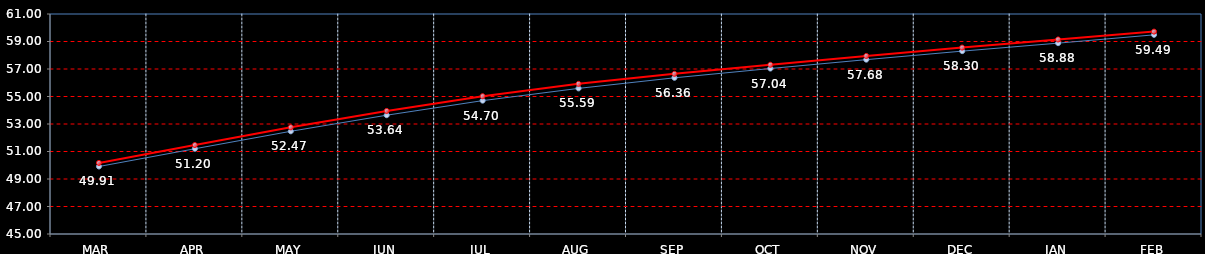
| Category | Last | Settlement |
|---|---|---|
| MAR | 49.91 | 50.17 |
| APR | 51.2 | 51.47 |
| MAY | 52.47 | 52.76 |
| JUN | 53.64 | 53.95 |
| JUL | 54.7 | 55.02 |
| AUG | 55.59 | 55.92 |
| SEP | 56.36 | 56.65 |
| OCT | 57.035 | 57.31 |
| NOV | 57.68 | 57.95 |
| DEC | 58.3 | 58.56 |
| JAN | 58.88 | 59.15 |
| FEB | 59.485 | 59.72 |